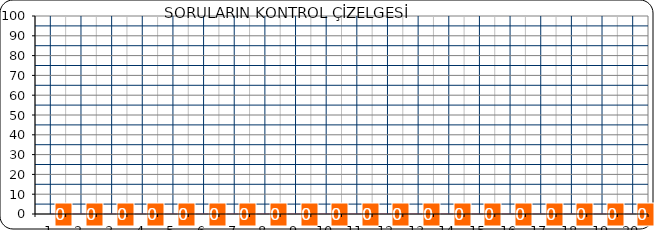
| Category | Series 1 |
|---|---|
| 0 | 0 |
| 1 | 0 |
| 2 | 0 |
| 3 | 0 |
| 4 | 0 |
| 5 | 0 |
| 6 | 0 |
| 7 | 0 |
| 8 | 0 |
| 9 | 0 |
| 10 | 0 |
| 11 | 0 |
| 12 | 0 |
| 13 | 0 |
| 14 | 0 |
| 15 | 0 |
| 16 | 0 |
| 17 | 0 |
| 18 | 0 |
| 19 | 0 |